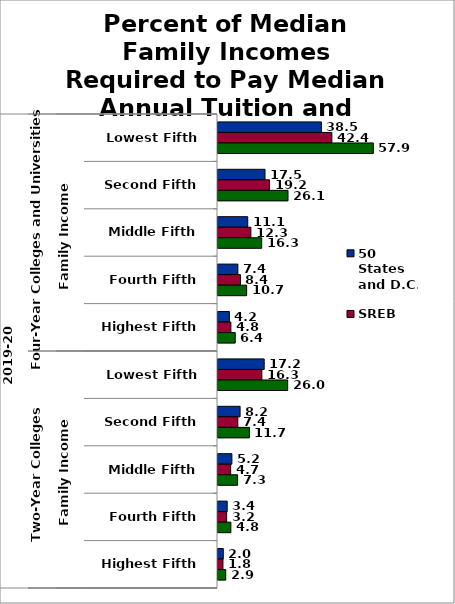
| Category | 50 States and D.C. | SREB states | State |
|---|---|---|---|
| 0 | 38.537 | 42.432 | 57.883 |
| 1 | 17.517 | 19.205 | 26.09 |
| 2 | 11.079 | 12.25 | 16.286 |
| 3 | 7.411 | 8.375 | 10.678 |
| 4 | 4.241 | 4.802 | 6.431 |
| 5 | 17.217 | 16.338 | 25.966 |
| 6 | 8.239 | 7.395 | 11.704 |
| 7 | 5.177 | 4.717 | 7.306 |
| 8 | 3.424 | 3.225 | 4.79 |
| 9 | 1.968 | 1.849 | 2.885 |